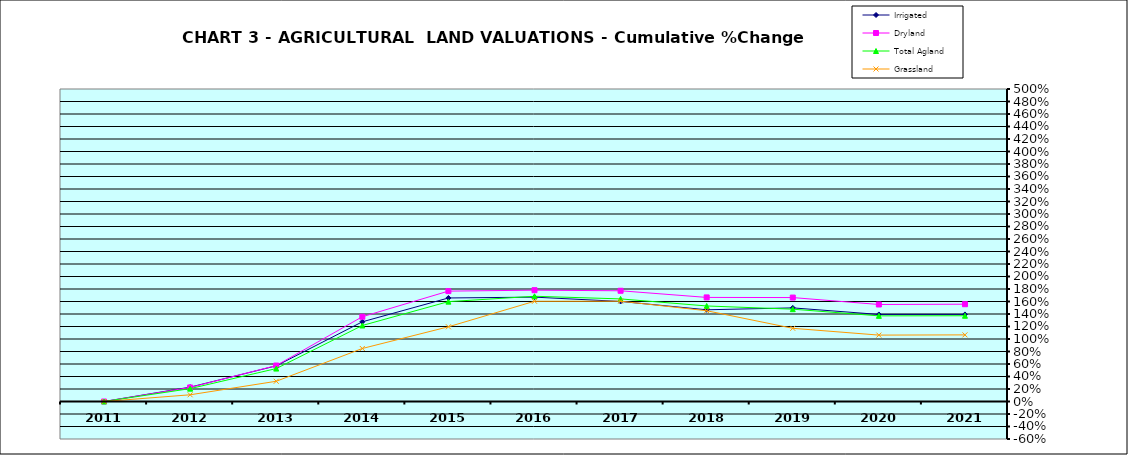
| Category | Irrigated | Dryland | Total Agland | Grassland |
|---|---|---|---|---|
| 2011.0 | 0 | 0 | 0 | 0 |
| 2012.0 | 0.23 | 0.225 | 0.206 | 0.107 |
| 2013.0 | 0.571 | 0.575 | 0.527 | 0.324 |
| 2014.0 | 1.275 | 1.356 | 1.216 | 0.848 |
| 2015.0 | 1.656 | 1.766 | 1.598 | 1.195 |
| 2016.0 | 1.67 | 1.781 | 1.684 | 1.604 |
| 2017.0 | 1.601 | 1.772 | 1.642 | 1.605 |
| 2018.0 | 1.467 | 1.665 | 1.529 | 1.452 |
| 2019.0 | 1.498 | 1.663 | 1.477 | 1.171 |
| 2020.0 | 1.393 | 1.552 | 1.37 | 1.062 |
| 2021.0 | 1.393 | 1.557 | 1.372 | 1.066 |